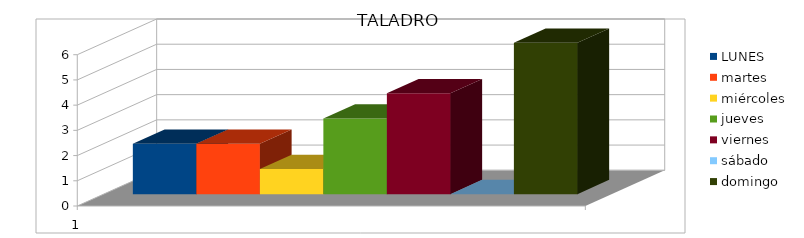
| Category | LUNES | martes | miércoles | jueves | viernes | sábado | domingo |
|---|---|---|---|---|---|---|---|
| 0 | 2 | 2 | 1 | 3 | 4 | 0 | 6 |